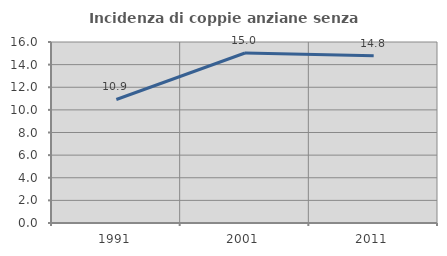
| Category | Incidenza di coppie anziane senza figli  |
|---|---|
| 1991.0 | 10.92 |
| 2001.0 | 15.029 |
| 2011.0 | 14.793 |